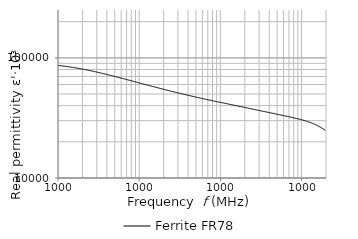
| Category | Ferrite FR78 |
|---|---|
| 10000.0 | 86609.98 |
| 10192.3 | 86480.167 |
| 10388.3 | 86185.504 |
| 10588.1 | 86054.147 |
| 10791.8 | 85929.092 |
| 10999.3 | 85794.964 |
| 11210.9 | 85660.25 |
| 11426.5 | 85517.53 |
| 11646.2 | 85383.122 |
| 11870.2 | 85239.849 |
| 12098.5 | 85090.744 |
| 12331.2 | 84936.381 |
| 12568.4 | 84789.567 |
| 12810.1 | 84645.527 |
| 13056.5 | 84498.533 |
| 13307.6 | 84344.564 |
| 13563.5 | 84187.806 |
| 13824.4 | 84037.118 |
| 14090.2 | 83869.674 |
| 14361.2 | 83702.937 |
| 14637.4 | 83539.021 |
| 14919.0 | 83374.886 |
| 15205.9 | 83210.631 |
| 15498.3 | 83044.739 |
| 15796.4 | 82872.157 |
| 16100.2 | 82701.217 |
| 16409.9 | 82535.109 |
| 16725.5 | 82362.223 |
| 17047.1 | 82183.761 |
| 17375.0 | 81999.912 |
| 17709.2 | 81815.522 |
| 18049.7 | 81624.41 |
| 18396.9 | 81426.424 |
| 18750.7 | 81230.809 |
| 19111.3 | 81046.364 |
| 19478.9 | 80852.053 |
| 19853.5 | 80652.995 |
| 20235.3 | 80455.529 |
| 20624.5 | 80263.199 |
| 21021.2 | 80059.505 |
| 21425.5 | 79853.459 |
| 21837.5 | 79650.337 |
| 22257.5 | 79452.146 |
| 22685.6 | 79250.829 |
| 23121.9 | 79048.096 |
| 23566.6 | 78837.845 |
| 24019.8 | 78624.398 |
| 24481.8 | 78413.883 |
| 24952.6 | 78210.219 |
| 25432.5 | 77994.517 |
| 25921.7 | 77783.422 |
| 26420.2 | 77568.151 |
| 26928.3 | 77356.167 |
| 27446.2 | 77136.771 |
| 27974.1 | 76921.416 |
| 28512.1 | 76697.338 |
| 29060.5 | 76478.053 |
| 29619.4 | 76258.067 |
| 30189.0 | 76033.634 |
| 30769.6 | 75811.383 |
| 31361.4 | 75588.488 |
| 31964.6 | 75364.446 |
| 32579.3 | 75138.143 |
| 33205.9 | 74909.616 |
| 33844.5 | 74680.718 |
| 34495.4 | 74452.178 |
| 35158.9 | 74230.979 |
| 35835.1 | 74005.182 |
| 36524.3 | 73775.727 |
| 37226.7 | 73548.614 |
| 37942.7 | 73320.383 |
| 38672.4 | 73087.164 |
| 39416.2 | 72857.78 |
| 40174.3 | 72629.5 |
| 40946.9 | 72396.737 |
| 41734.4 | 72164.369 |
| 42537.1 | 71933.243 |
| 43355.2 | 71703.204 |
| 44189.0 | 71480.484 |
| 45038.9 | 71246.74 |
| 45905.1 | 71012.384 |
| 46787.9 | 70783.622 |
| 47687.8 | 70553.179 |
| 48604.9 | 70326.004 |
| 49539.7 | 70096.972 |
| 50492.5 | 69868.683 |
| 51463.6 | 69643.361 |
| 52453.4 | 69414.306 |
| 53462.2 | 69186.621 |
| 54490.4 | 68956.25 |
| 55538.4 | 68727.425 |
| 56606.5 | 68501.469 |
| 57695.2 | 68270.686 |
| 58804.8 | 68040.647 |
| 59935.8 | 67816.611 |
| 61088.5 | 67582.378 |
| 62263.4 | 67358.022 |
| 63460.9 | 67128.994 |
| 64681.4 | 66905.06 |
| 65925.4 | 66680.844 |
| 67193.3 | 66452.76 |
| 68485.6 | 66230.202 |
| 69802.7 | 66003.197 |
| 71145.2 | 65777.903 |
| 72513.5 | 65552.904 |
| 73908.1 | 65329.931 |
| 75329.5 | 65105.223 |
| 76778.3 | 64882.868 |
| 78255.0 | 64658.741 |
| 79760.0 | 64434.059 |
| 81294.0 | 64214.698 |
| 82857.5 | 63993.23 |
| 84451.0 | 63770.767 |
| 86075.2 | 63552.9 |
| 87730.7 | 63338.291 |
| 89417.9 | 63124.87 |
| 91137.7 | 62909.636 |
| 92890.5 | 62694.203 |
| 94677.0 | 62476.105 |
| 96497.9 | 62259.76 |
| 98353.8 | 62043.254 |
| 100245.0 | 61819.624 |
| 102173.0 | 61607.07 |
| 104138.0 | 61396.668 |
| 106141.0 | 61187.578 |
| 108183.0 | 60974.844 |
| 110263.0 | 60765.997 |
| 112384.0 | 60557.701 |
| 114545.0 | 60349.92 |
| 116748.0 | 60148.574 |
| 118994.0 | 59939.335 |
| 121282.0 | 59736.619 |
| 123615.0 | 59531.579 |
| 125992.0 | 59334.133 |
| 128415.0 | 59129.789 |
| 130885.0 | 58925.319 |
| 133402.0 | 58722.824 |
| 135968.0 | 58599.612 |
| 138583.0 | 58327.737 |
| 141248.0 | 58135.26 |
| 143965.0 | 57941.491 |
| 146734.0 | 57747.103 |
| 149556.0 | 57552.142 |
| 152432.0 | 57357.919 |
| 155364.0 | 57165.038 |
| 158352.0 | 56974.785 |
| 161397.0 | 56785.309 |
| 164501.0 | 56596.778 |
| 167665.0 | 56406.417 |
| 170890.0 | 56220.624 |
| 174176.0 | 56034.199 |
| 177526.0 | 55846.586 |
| 180940.0 | 55667.528 |
| 184420.0 | 55483.599 |
| 187967.0 | 55298.555 |
| 191582.0 | 55113.873 |
| 195267.0 | 54930.644 |
| 199022.0 | 54752.368 |
| 202850.0 | 54574.349 |
| 206751.0 | 54397.692 |
| 210728.0 | 54217.162 |
| 214780.0 | 54038.801 |
| 218911.0 | 53862.126 |
| 223121.0 | 53685.504 |
| 227413.0 | 53509.682 |
| 231786.0 | 53333.369 |
| 236244.0 | 53159.952 |
| 240788.0 | 52989.233 |
| 245419.0 | 52819.849 |
| 250139.0 | 52651.482 |
| 254949.0 | 52487.823 |
| 259853.0 | 52318.339 |
| 264850.0 | 52149.549 |
| 269944.0 | 51983.316 |
| 275136.0 | 51832.089 |
| 280427.0 | 51675.775 |
| 285821.0 | 51529.261 |
| 291318.0 | 51369.014 |
| 296920.0 | 51207.622 |
| 302631.0 | 51044.959 |
| 308451.0 | 50886.577 |
| 314383.0 | 50726.405 |
| 320430.0 | 50568.445 |
| 326593.0 | 50414.946 |
| 332874.0 | 50263.493 |
| 339276.0 | 50108.861 |
| 345801.0 | 49957.506 |
| 352451.0 | 49802.291 |
| 359230.0 | 49651.886 |
| 366139.0 | 49495.526 |
| 373181.0 | 49343.117 |
| 380358.0 | 49198.392 |
| 387673.0 | 49051.503 |
| 395129.0 | 48904.058 |
| 402728.0 | 48761.025 |
| 410474.0 | 48615.264 |
| 418368.0 | 48468.114 |
| 426414.0 | 48321.386 |
| 434615.0 | 48174.657 |
| 442974.0 | 48027.32 |
| 451494.0 | 47887.353 |
| 460177.0 | 47748.424 |
| 469027.0 | 47606.519 |
| 478048.0 | 47465.181 |
| 487242.0 | 47325.716 |
| 496613.0 | 47186.042 |
| 506164.0 | 47049.462 |
| 515899.0 | 46913.531 |
| 525821.0 | 46774.973 |
| 535934.0 | 46637.866 |
| 546241.0 | 46503.957 |
| 556746.0 | 46370.107 |
| 567454.0 | 46235.876 |
| 578368.0 | 46104.518 |
| 589491.0 | 45981.986 |
| 600828.0 | 45844.451 |
| 612384.0 | 45712.965 |
| 624162.0 | 45583.098 |
| 636166.0 | 45456.732 |
| 648401.0 | 45330.186 |
| 660871.0 | 45200.85 |
| 673581.0 | 45071.828 |
| 686536.0 | 44945.574 |
| 699740.0 | 44821.125 |
| 713198.0 | 44690.632 |
| 726914.0 | 44563.07 |
| 740894.0 | 44439.738 |
| 755144.0 | 44317.884 |
| 769667.0 | 44192.875 |
| 784470.0 | 44066.589 |
| 799557.0 | 43943.828 |
| 814934.0 | 43819.238 |
| 830608.0 | 43698.481 |
| 846582.0 | 43575.059 |
| 862864.0 | 43457.219 |
| 879459.0 | 43336.203 |
| 896373.0 | 43216.54 |
| 913613.0 | 43098.581 |
| 931184.0 | 42979.125 |
| 949093.0 | 42861.515 |
| 967346.0 | 42742.221 |
| 985951.0 | 42627.562 |
| 1004910.0 | 42569.943 |
| 1024240.0 | 42457.677 |
| 1043940.0 | 42344.988 |
| 1064020.0 | 42230.26 |
| 1084480.0 | 42112.396 |
| 1105340.0 | 42001.563 |
| 1126600.0 | 41886.202 |
| 1148260.0 | 41773.481 |
| 1170350.0 | 41660.737 |
| 1192860.0 | 41545.857 |
| 1215800.0 | 41441.256 |
| 1239180.0 | 41328.571 |
| 1263010.0 | 41218.262 |
| 1287300.0 | 41105.279 |
| 1312060.0 | 40997.286 |
| 1337300.0 | 40888.699 |
| 1363010.0 | 40778.623 |
| 1389230.0 | 40666.22 |
| 1415950.0 | 40557.061 |
| 1443180.0 | 40448.063 |
| 1470940.0 | 40338.716 |
| 1499230.0 | 40233.331 |
| 1528060.0 | 40123.341 |
| 1557450.0 | 40015.343 |
| 1587400.0 | 39907.157 |
| 1617930.0 | 39800.021 |
| 1649050.0 | 39694.45 |
| 1680760.0 | 39584.508 |
| 1713090.0 | 39473.795 |
| 1746040.0 | 39374.555 |
| 1779620.0 | 39271.148 |
| 1813840.0 | 39165.026 |
| 1848730.0 | 39058.055 |
| 1884280.0 | 38951.627 |
| 1920520.0 | 38849.476 |
| 1957460.0 | 38744.289 |
| 1995110.0 | 38639.289 |
| 2033480.0 | 38531.496 |
| 2072580.0 | 38431.171 |
| 2112450.0 | 38325.923 |
| 2153070.0 | 38221.683 |
| 2194480.0 | 38116.798 |
| 2236690.0 | 38013.958 |
| 2279700.0 | 37914.255 |
| 2323550.0 | 37814.316 |
| 2368240.0 | 37712.428 |
| 2413780.0 | 37612.921 |
| 2460210.0 | 37510.771 |
| 2507520.0 | 37410.069 |
| 2555750.0 | 37309.163 |
| 2604900.0 | 37206.802 |
| 2655000.0 | 37105.876 |
| 2706060.0 | 37008.373 |
| 2758110.0 | 36902.279 |
| 2811150.0 | 36805.659 |
| 2865220.0 | 36706.815 |
| 2920320.0 | 36606.966 |
| 2976490.0 | 36507.399 |
| 3033730.0 | 36411.378 |
| 3092080.0 | 36311.172 |
| 3151550.0 | 36214.033 |
| 3212160.0 | 36117.269 |
| 3273940.0 | 36021.513 |
| 3336900.0 | 35924.97 |
| 3401080.0 | 35830.478 |
| 3466490.0 | 35734.307 |
| 3533160.0 | 35637.712 |
| 3601110.0 | 35540.888 |
| 3670370.0 | 35447.333 |
| 3740960.0 | 35351.367 |
| 3812910.0 | 35255.475 |
| 3886240.0 | 35160.067 |
| 3960980.0 | 35064.464 |
| 4037160.0 | 34972.573 |
| 4114810.0 | 34878.647 |
| 4193950.0 | 34787.325 |
| 4274610.0 | 34693.581 |
| 4356820.0 | 34603.38 |
| 4440610.0 | 34507.276 |
| 4526010.0 | 34412.492 |
| 4613060.0 | 34319.8 |
| 4701780.0 | 34226.989 |
| 4792210.0 | 34135.484 |
| 4884370.0 | 34040.831 |
| 4978310.0 | 33947.413 |
| 5074060.0 | 33857.338 |
| 5171640.0 | 33769.452 |
| 5271110.0 | 33685.169 |
| 5372480.0 | 33591.946 |
| 5475810.0 | 33501.265 |
| 5581120.0 | 33416.587 |
| 5688460.0 | 33324.843 |
| 5797870.0 | 33231.276 |
| 5909370.0 | 33138.256 |
| 6023030.0 | 33047.064 |
| 6138860.0 | 32956.701 |
| 6256930.0 | 32867.924 |
| 6377270.0 | 32775.146 |
| 6499920.0 | 32686.045 |
| 6624930.0 | 32598.808 |
| 6752340.0 | 32504.815 |
| 6882200.0 | 32410.462 |
| 7014570.0 | 32317.652 |
| 7149470.0 | 32224.824 |
| 7286980.0 | 32134.895 |
| 7427120.0 | 32041.489 |
| 7569960.0 | 31946.381 |
| 7715550.0 | 31853.804 |
| 7863940.0 | 31762.288 |
| 8015190.0 | 31669.349 |
| 8169340.0 | 31577.485 |
| 8326450.0 | 31479.45 |
| 8486590.0 | 31382.012 |
| 8649810.0 | 31283.056 |
| 8816170.0 | 31186.491 |
| 8985730.0 | 31090.041 |
| 9158540.0 | 30993.105 |
| 9334690.0 | 30895.617 |
| 9514210.0 | 30793.867 |
| 9697200.0 | 30688.28 |
| 9883700.0 | 30581.588 |
| 10073800.0 | 30475.033 |
| 10267500.0 | 30366.747 |
| 10465000.0 | 30254.704 |
| 10666300.0 | 30144.832 |
| 10871400.0 | 30033.314 |
| 11080500.0 | 29918.427 |
| 11293600.0 | 29800.479 |
| 11510800.0 | 29680.427 |
| 11732200.0 | 29561.298 |
| 11957800.0 | 29434.708 |
| 12187800.0 | 29306.097 |
| 12422200.0 | 29176.954 |
| 12661100.0 | 29042.117 |
| 12904600.0 | 28904.505 |
| 13152800.0 | 28765.591 |
| 13405800.0 | 28623.941 |
| 13663600.0 | 28479.647 |
| 13926400.0 | 28331.766 |
| 14194200.0 | 28177.669 |
| 14467200.0 | 28024.797 |
| 14745400.0 | 27862.531 |
| 15029000.0 | 27676.451 |
| 15318100.0 | 27505.311 |
| 15612700.0 | 27327.735 |
| 15913000.0 | 27148.521 |
| 16219000.0 | 26964.387 |
| 16530900.0 | 26778.444 |
| 16848900.0 | 26584.669 |
| 17172900.0 | 26388.402 |
| 17503200.0 | 26186.231 |
| 17839800.0 | 25977.889 |
| 18182900.0 | 25768.525 |
| 18532600.0 | 25552.562 |
| 18889100.0 | 25331.292 |
| 19252300.0 | 25106.826 |
| 19622600.0 | 24875.531 |